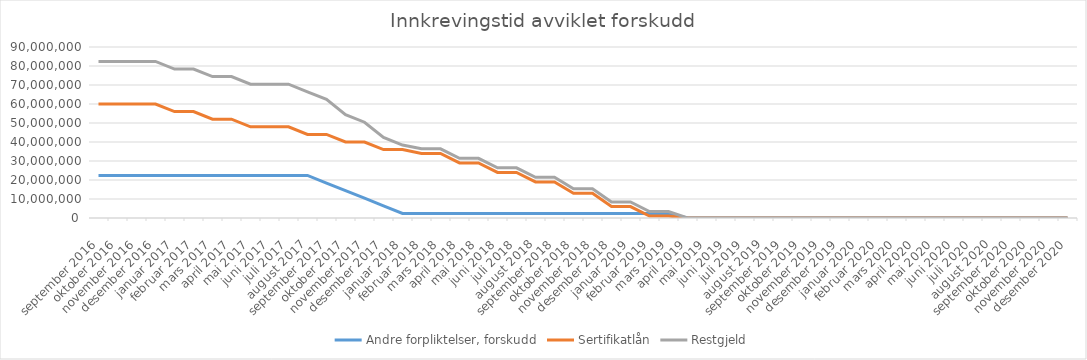
| Category | Andre forpliktelser, forskudd | Sertifikatlån | Restgjeld |
|---|---|---|---|
| 2016-09-01 | 22411000 | 60000000 | 82411000 |
| 2016-10-01 | 22411000 | 60000000 | 82411000 |
| 2016-11-01 | 22411000 | 60000000 | 82411000 |
| 2016-12-01 | 22411000 | 60000000 | 82411000 |
| 2017-01-01 | 22411000 | 56000000 | 78411000 |
| 2017-02-01 | 22411000 | 56000000 | 78411000 |
| 2017-03-01 | 22411000 | 52000000 | 74411000 |
| 2017-04-01 | 22411000 | 52000000 | 74411000 |
| 2017-05-01 | 22411000 | 48000000 | 70411000 |
| 2017-06-01 | 22411000 | 48000000 | 70411000 |
| 2017-07-01 | 22411000 | 48000000 | 70411000 |
| 2017-08-01 | 22411000 | 44000000 | 66411000 |
| 2017-09-01 | 18411000 | 44000000 | 62411000 |
| 2017-10-01 | 14411000 | 40000000 | 54411000 |
| 2017-11-01 | 10411000 | 40000000 | 50411000 |
| 2017-12-01 | 6411000 | 36000000 | 42411000 |
| 2018-01-01 | 2411000 | 36000000 | 38411000 |
| 2018-02-01 | 2411000 | 34000000 | 36411000 |
| 2018-03-01 | 2411000 | 34000000 | 36411000 |
| 2018-04-01 | 2411000 | 29000000 | 31411000 |
| 2018-05-01 | 2411000 | 29000000 | 31411000 |
| 2018-06-01 | 2411000 | 24000000 | 26411000 |
| 2018-07-01 | 2411000 | 24000000 | 26411000 |
| 2018-08-01 | 2411000 | 19000000 | 21411000 |
| 2018-09-01 | 2411000 | 19000000 | 21411000 |
| 2018-10-01 | 2411000 | 13000000 | 15411000 |
| 2018-11-01 | 2411000 | 13000000 | 15411000 |
| 2018-12-01 | 2411000 | 6000000 | 8411000 |
| 2019-01-01 | 2411000 | 6000000 | 8411000 |
| 2019-02-01 | 2411000 | 1000000 | 3411000 |
| 2019-03-01 | 2411000 | 1000000 | 3411000 |
| 2019-04-01 | 0 | 0 | 0 |
| 2019-05-01 | 0 | 0 | 0 |
| 2019-06-01 | 0 | 0 | 0 |
| 2019-07-01 | 0 | 0 | 0 |
| 2019-08-01 | 0 | 0 | 0 |
| 2019-09-01 | 0 | 0 | 0 |
| 2019-10-01 | 0 | 0 | 0 |
| 2019-11-01 | 0 | 0 | 0 |
| 2019-12-01 | 0 | 0 | 0 |
| 2020-01-01 | 0 | 0 | 0 |
| 2020-02-01 | 0 | 0 | 0 |
| 2020-03-01 | 0 | 0 | 0 |
| 2020-04-01 | 0 | 0 | 0 |
| 2020-05-01 | 0 | 0 | 0 |
| 2020-06-01 | 0 | 0 | 0 |
| 2020-07-01 | 0 | 0 | 0 |
| 2020-08-01 | 0 | 0 | 0 |
| 2020-09-01 | 0 | 0 | 0 |
| 2020-10-01 | 0 | 0 | 0 |
| 2020-11-01 | 0 | 0 | 0 |
| 2020-12-01 | 0 | 0 | 0 |